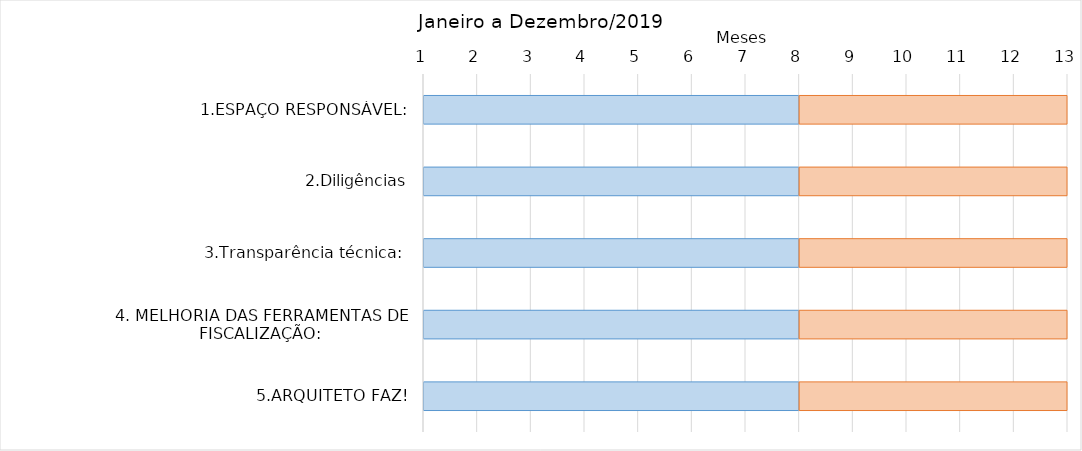
| Category | Início | Duração |
|---|---|---|
| 1.ESPAÇO RESPONSÁVEL: | 8 | 5 |
| 2.Diligências | 8 | 5 |
| 3.Transparência técnica:  | 8 | 5 |
| 4. MELHORIA DAS FERRAMENTAS DE FISCALIZAÇÃO:  | 8 | 5 |
| 5.ARQUITETO FAZ! | 8 | 5 |